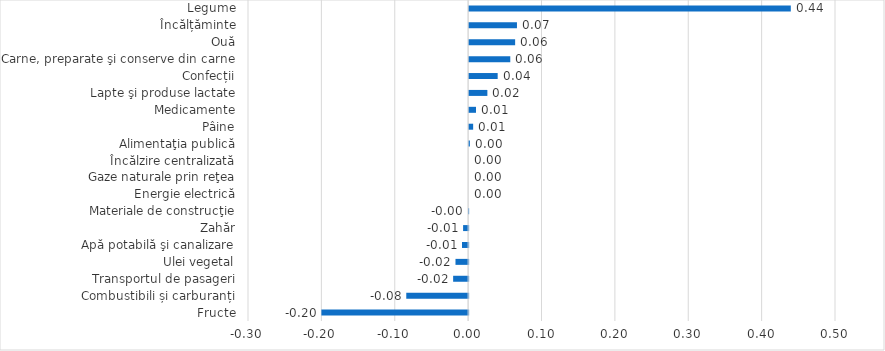
| Category | Series 0 |
|---|---|
| Fructe | -0.2 |
| Combustibili și carburanți | -0.084 |
| Transportul de pasageri | -0.02 |
| Ulei vegetal | -0.017 |
| Apă potabilă şi canalizare | -0.008 |
| Zahăr | -0.007 |
| Materiale de construcţie | 0 |
| Energie electrică | 0 |
| Gaze naturale prin reţea | 0 |
| Încălzire centralizată | 0 |
| Alimentaţia publică | 0.001 |
| Pâine | 0.005 |
| Medicamente | 0.009 |
| Lapte şi produse lactate | 0.025 |
| Confecții | 0.039 |
| Carne, preparate şi conserve din carne | 0.056 |
| Ouă | 0.063 |
| Încălțăminte | 0.065 |
| Legume | 0.438 |